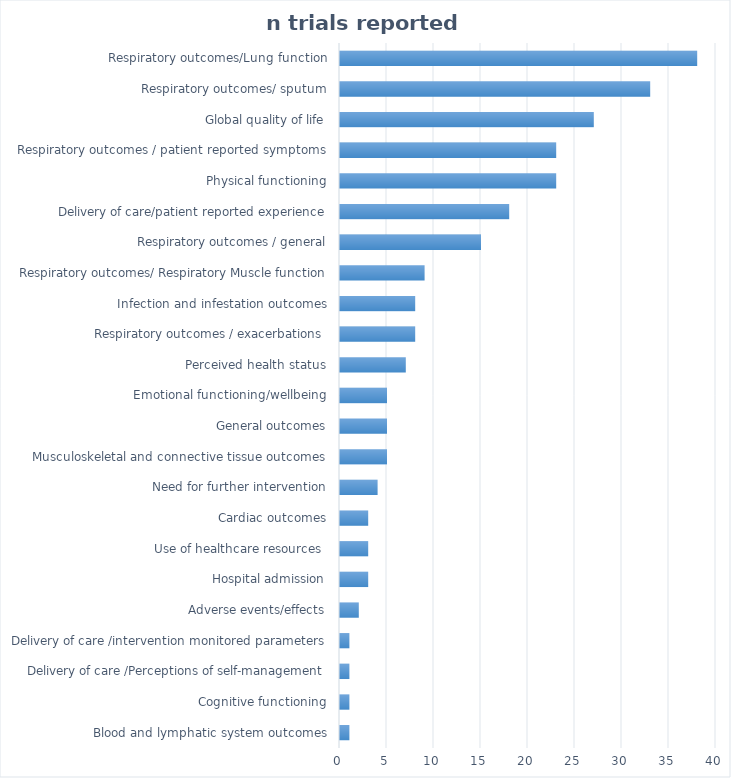
| Category | n trials reported domain |
|---|---|
| Blood and lymphatic system outcomes | 1 |
| Cognitive functioning | 1 |
| Delivery of care /Perceptions of self-management | 1 |
| Delivery of care /intervention monitored parameters | 1 |
|  Adverse events/effects | 2 |
| Hospital admission | 3 |
| Use of healthcare resources  | 3 |
| Cardiac outcomes | 3 |
|  Need for further intervention | 4 |
| Musculoskeletal and connective tissue outcomes | 5 |
| General outcomes | 5 |
| Emotional functioning/wellbeing | 5 |
| Perceived health status | 7 |
| Respiratory outcomes / exacerbations  | 8 |
| Infection and infestation outcomes | 8 |
| Respiratory outcomes/ Respiratory Muscle function | 9 |
| Respiratory outcomes / general | 15 |
| Delivery of care/patient reported experience | 18 |
| Physical functioning | 23 |
| Respiratory outcomes / patient reported symptoms | 23 |
| Global quality of life | 27 |
| Respiratory outcomes/ sputum | 33 |
| Respiratory outcomes/Lung function | 38 |